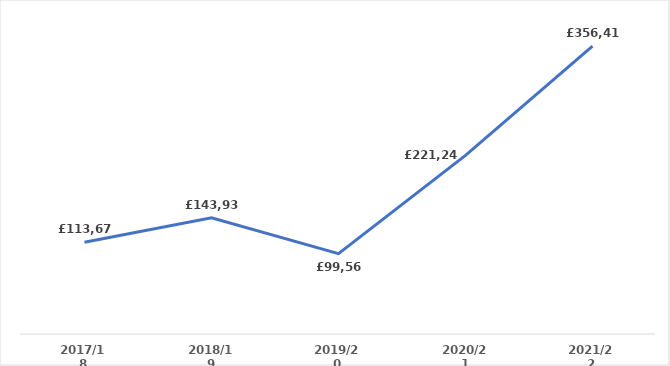
| Category | Series 0 |
|---|---|
| 2017/18 | 113678.41 |
| 2018/19 | 143938.69 |
| 2019/20 | 99565.35 |
| 2020/21 | 221246.13 |
| 2021/22 | 356412.584 |